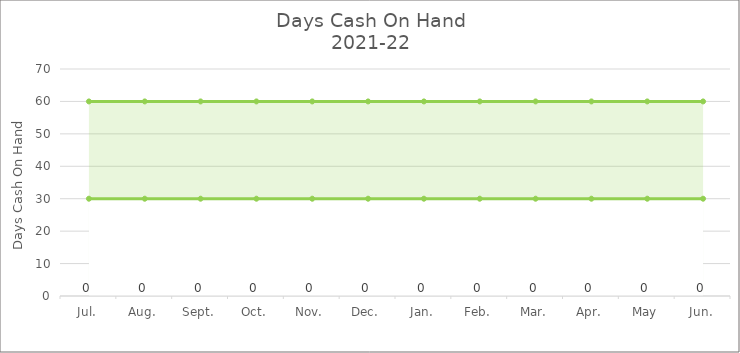
| Category | Days Cash on Hand |
|---|---|
| Jul. | 0 |
| Aug. | 0 |
| Sept. | 0 |
| Oct. | 0 |
| Nov. | 0 |
| Dec. | 0 |
| Jan. | 0 |
| Feb. | 0 |
| Mar. | 0 |
| Apr. | 0 |
| May | 0 |
| Jun. | 0 |